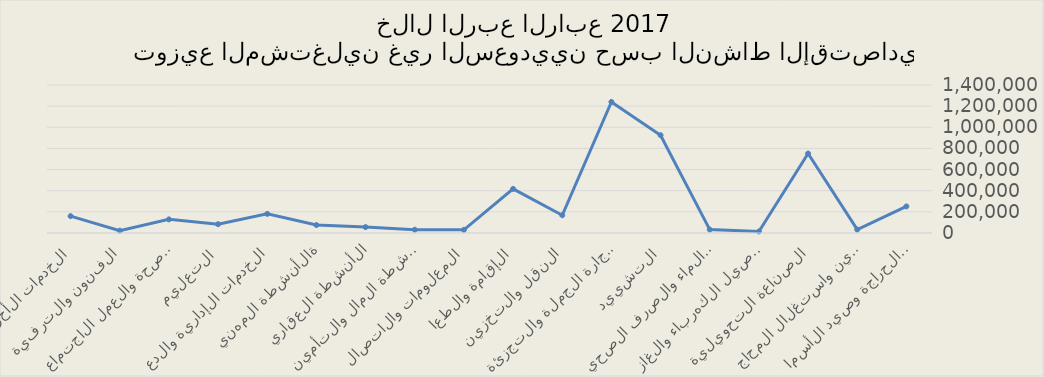
| Category | Series 0 |
|---|---|
| الزراعة والحراجة وصيد الأسماك | 251645 |
| التعدين واستغلال المحاجر | 32493 |
| الصناعة التحويلية | 751550 |
| توصيل الكهرباء والغاز  | 14599 |
| امدادات الماء والصرف الصحي | 32387 |
| التشييد | 924855 |
| تجارة الجملة والتجزئة | 1240167 |
| النقل والتخزين | 167896 |
| الإقامة والطعام | 417012 |
| المعلومات والاتصالات | 30103 |
| أنشطة المال والتأمين | 31263 |
| الأنشطة العقارية | 55704 |
| الأنشطة المهنية  | 75127 |
| الخدمات الإدارية والدعم | 180909 |
| التعليم | 83524 |
| الصحة والعمل الاجتماعي | 128899 |
| الفنون والترفية | 22197 |
| الخدمات الأخرى | 159425 |